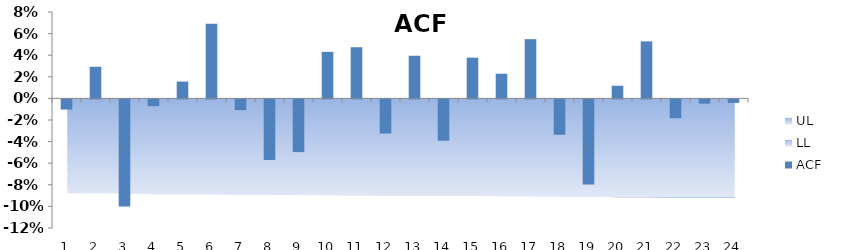
| Category | ACF |
|---|---|
| 0 | -0.009 |
| 1 | 0.029 |
| 2 | -0.099 |
| 3 | -0.006 |
| 4 | 0.016 |
| 5 | 0.069 |
| 6 | -0.01 |
| 7 | -0.056 |
| 8 | -0.049 |
| 9 | 0.043 |
| 10 | 0.047 |
| 11 | -0.032 |
| 12 | 0.039 |
| 13 | -0.038 |
| 14 | 0.038 |
| 15 | 0.023 |
| 16 | 0.055 |
| 17 | -0.033 |
| 18 | -0.079 |
| 19 | 0.012 |
| 20 | 0.053 |
| 21 | -0.017 |
| 22 | -0.004 |
| 23 | -0.003 |